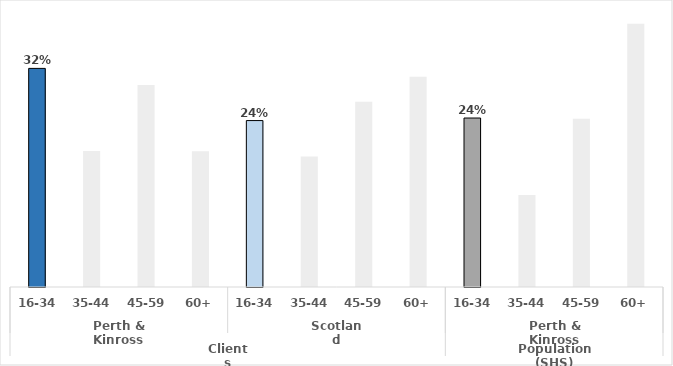
| Category | Series 0 |
|---|---|
| 0 | 0.316 |
| 1 | 0.196 |
| 2 | 0.292 |
| 3 | 0.196 |
| 4 | 0.24 |
| 5 | 0.188 |
| 6 | 0.268 |
| 7 | 0.304 |
| 8 | 0.244 |
| 9 | 0.133 |
| 10 | 0.243 |
| 11 | 0.38 |